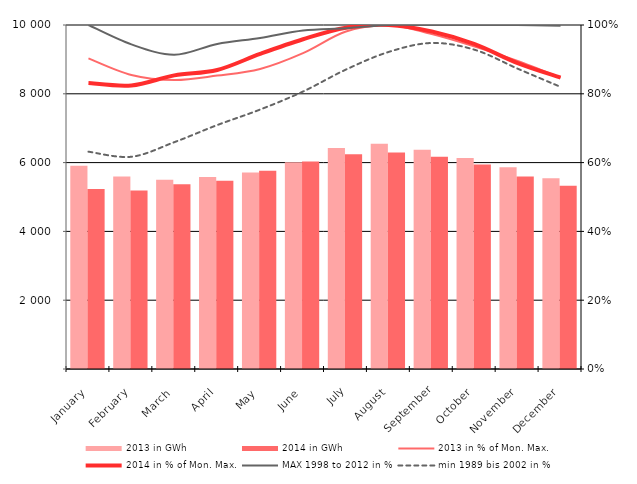
| Category | 2013 in GWh | 2014 in GWh |
|---|---|---|
| January | 5911.492 | 5230.445 |
| February | 5595.423 | 5187.359 |
| March | 5500.548 | 5371.412 |
| April | 5584.818 | 5470.349 |
| May | 5711.49 | 5764.663 |
| June | 6013.013 | 6032.697 |
| July | 6423.067 | 6244.15 |
| August | 6547.282 | 6292.825 |
| September | 6373.254 | 6173.692 |
| October | 6136.397 | 5942.195 |
| November | 5863.681 | 5595.468 |
| December | 5545.689 | 5329.887 |